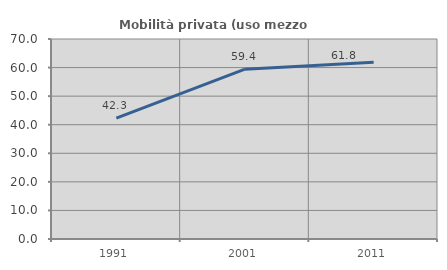
| Category | Mobilità privata (uso mezzo privato) |
|---|---|
| 1991.0 | 42.313 |
| 2001.0 | 59.449 |
| 2011.0 | 61.828 |